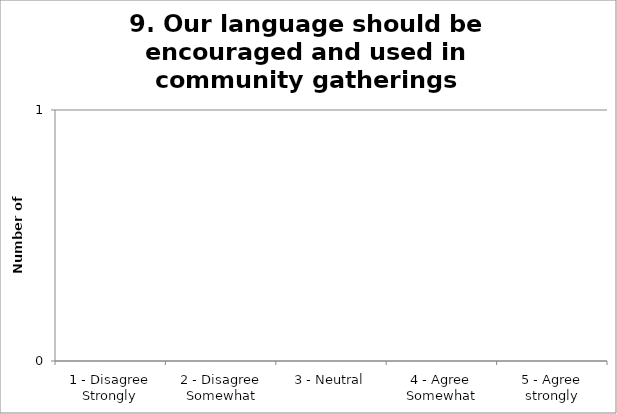
| Category | 9. Our language should be encouraged and used in community gatherings |
|---|---|
| 1 - Disagree Strongly | 0 |
| 2 - Disagree Somewhat | 0 |
| 3 - Neutral | 0 |
| 4 - Agree Somewhat | 0 |
| 5 - Agree strongly | 0 |